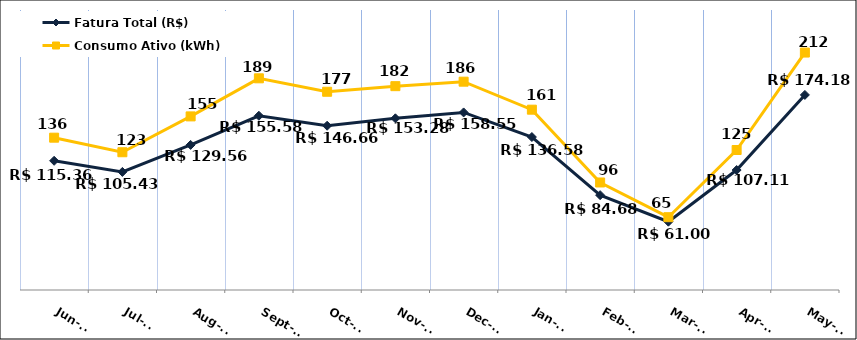
| Category | Fatura Total (R$) |
|---|---|
| 2023-06-01 | 115.36 |
| 2023-07-01 | 105.43 |
| 2023-08-01 | 129.56 |
| 2023-09-01 | 155.58 |
| 2023-10-01 | 146.66 |
| 2023-11-01 | 153.28 |
| 2023-12-01 | 158.55 |
| 2024-01-01 | 136.58 |
| 2024-02-01 | 84.68 |
| 2024-03-01 | 61 |
| 2024-04-01 | 107.11 |
| 2024-05-01 | 174.18 |